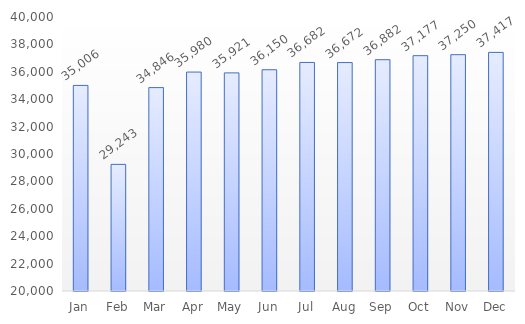
| Category | Series 0 |
|---|---|
| Jan | 35006 |
| Feb | 29243 |
| Mar | 34846 |
| Apr | 35980 |
| May | 35921 |
| Jun | 36150 |
| Jul | 36682 |
| Aug | 36672 |
| Sep | 36882 |
| Oct | 37177 |
| Nov | 37250 |
| Dec | 37417 |